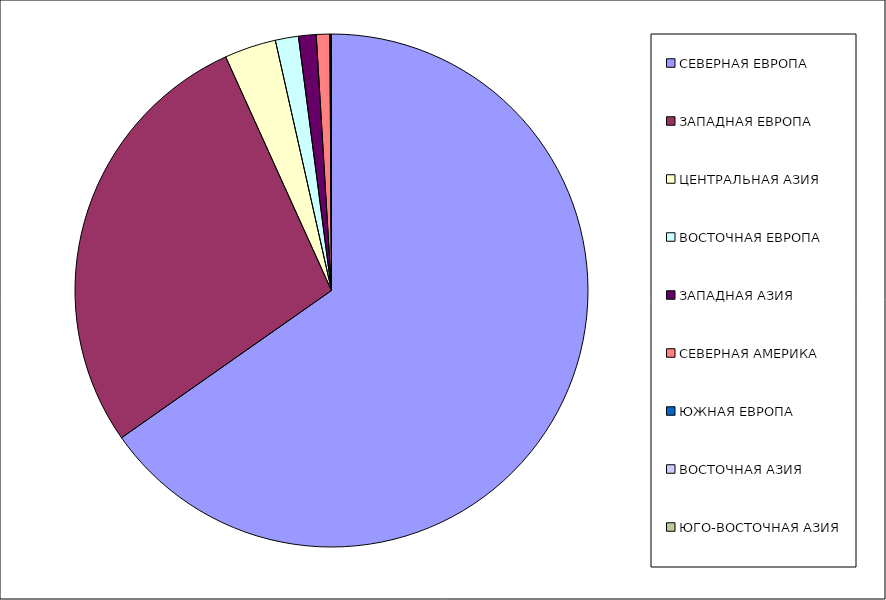
| Category | Оборот |
|---|---|
| СЕВЕРНАЯ ЕВРОПА | 65.265 |
| ЗАПАДНАЯ ЕВРОПА | 27.965 |
| ЦЕНТРАЛЬНАЯ АЗИЯ | 3.255 |
| ВОСТОЧНАЯ ЕВРОПА | 1.453 |
| ЗАПАДНАЯ АЗИЯ | 1.111 |
| СЕВЕРНАЯ АМЕРИКА | 0.849 |
| ЮЖНАЯ ЕВРОПА | 0.05 |
| ВОСТОЧНАЯ АЗИЯ | 0.049 |
| ЮГО-ВОСТОЧНАЯ АЗИЯ | 0.004 |